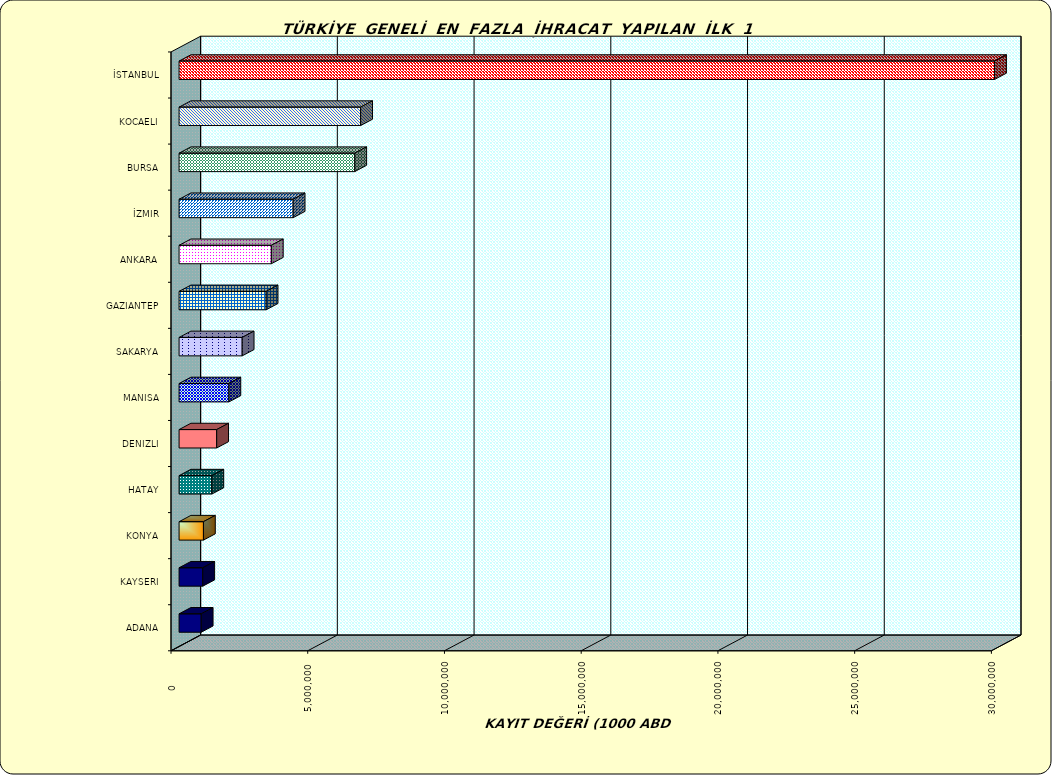
| Category | Series 0 |
|---|---|
| İSTANBUL | 29820720.499 |
| KOCAELI | 6639608.955 |
| BURSA | 6424493.835 |
| İZMIR | 4172054.937 |
| ANKARA | 3374082.837 |
| GAZIANTEP | 3183315.318 |
| SAKARYA | 2307341.658 |
| MANISA | 1821602.243 |
| DENIZLI | 1375180.886 |
| HATAY | 1198465.992 |
| KONYA | 890777.352 |
| KAYSERI | 865896.643 |
| ADANA | 810191.743 |